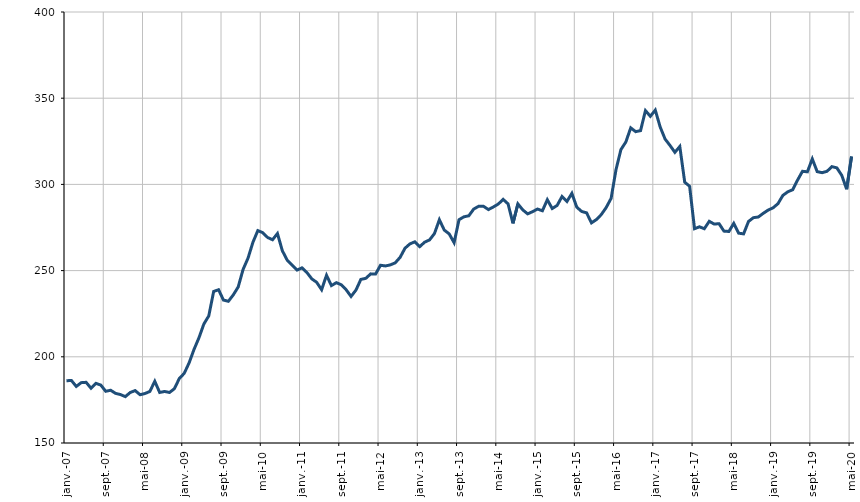
| Category | Catégorie D |
|---|---|
| 2007-01-01 | 186.1 |
| 2007-02-01 | 186.3 |
| 2007-03-01 | 182.8 |
| 2007-04-01 | 185 |
| 2007-05-01 | 185.2 |
| 2007-06-01 | 181.8 |
| 2007-07-01 | 184.6 |
| 2007-08-01 | 183.6 |
| 2007-09-01 | 180 |
| 2007-10-01 | 180.6 |
| 2007-11-01 | 178.8 |
| 2007-12-01 | 178.1 |
| 2008-01-01 | 176.9 |
| 2008-02-01 | 179.3 |
| 2008-03-01 | 180.4 |
| 2008-04-01 | 178 |
| 2008-05-01 | 178.7 |
| 2008-06-01 | 179.9 |
| 2008-07-01 | 185.8 |
| 2008-08-01 | 179.3 |
| 2008-09-01 | 179.9 |
| 2008-10-01 | 179.3 |
| 2008-11-01 | 181.5 |
| 2008-12-01 | 187.4 |
| 2009-01-01 | 190.4 |
| 2009-02-01 | 196.5 |
| 2009-03-01 | 204.3 |
| 2009-04-01 | 211 |
| 2009-05-01 | 219 |
| 2009-06-01 | 223.7 |
| 2009-07-01 | 237.9 |
| 2009-08-01 | 238.9 |
| 2009-09-01 | 232.9 |
| 2009-10-01 | 232.2 |
| 2009-11-01 | 235.9 |
| 2009-12-01 | 240.5 |
| 2010-01-01 | 250.7 |
| 2010-02-01 | 257.2 |
| 2010-03-01 | 266.4 |
| 2010-04-01 | 273.2 |
| 2010-05-01 | 272 |
| 2010-06-01 | 269.2 |
| 2010-07-01 | 267.9 |
| 2010-08-01 | 271.5 |
| 2010-09-01 | 261.5 |
| 2010-10-01 | 256 |
| 2010-11-01 | 253.1 |
| 2010-12-01 | 250.3 |
| 2011-01-01 | 251.6 |
| 2011-02-01 | 248.9 |
| 2011-03-01 | 245.2 |
| 2011-04-01 | 243.2 |
| 2011-05-01 | 238.9 |
| 2011-06-01 | 247.3 |
| 2011-07-01 | 241.3 |
| 2011-08-01 | 243 |
| 2011-09-01 | 241.8 |
| 2011-10-01 | 238.9 |
| 2011-11-01 | 235 |
| 2011-12-01 | 238.7 |
| 2012-01-01 | 244.9 |
| 2012-02-01 | 245.5 |
| 2012-03-01 | 248.1 |
| 2012-04-01 | 248 |
| 2012-05-01 | 253.1 |
| 2012-06-01 | 252.7 |
| 2012-07-01 | 253.3 |
| 2012-08-01 | 254.5 |
| 2012-09-01 | 257.7 |
| 2012-10-01 | 263 |
| 2012-11-01 | 265.5 |
| 2012-12-01 | 266.7 |
| 2013-01-01 | 263.9 |
| 2013-02-01 | 266.5 |
| 2013-03-01 | 267.8 |
| 2013-04-01 | 271.5 |
| 2013-05-01 | 279.5 |
| 2013-06-01 | 273.5 |
| 2013-07-01 | 271.3 |
| 2013-08-01 | 266.2 |
| 2013-09-01 | 279.5 |
| 2013-10-01 | 281.2 |
| 2013-11-01 | 281.8 |
| 2013-12-01 | 285.7 |
| 2014-01-01 | 287.3 |
| 2014-02-01 | 287.3 |
| 2014-03-01 | 285.4 |
| 2014-04-01 | 286.9 |
| 2014-05-01 | 288.6 |
| 2014-06-01 | 291.3 |
| 2014-07-01 | 288.7 |
| 2014-08-01 | 277.4 |
| 2014-09-01 | 288.7 |
| 2014-10-01 | 285.2 |
| 2014-11-01 | 282.9 |
| 2014-12-01 | 284.2 |
| 2015-01-01 | 285.7 |
| 2015-02-01 | 284.7 |
| 2015-03-01 | 291.1 |
| 2015-04-01 | 286 |
| 2015-05-01 | 287.8 |
| 2015-06-01 | 293 |
| 2015-07-01 | 290.1 |
| 2015-08-01 | 294.8 |
| 2015-09-01 | 286.8 |
| 2015-10-01 | 284.3 |
| 2015-11-01 | 283.5 |
| 2015-12-01 | 277.7 |
| 2016-01-01 | 279.6 |
| 2016-02-01 | 282.5 |
| 2016-03-01 | 286.6 |
| 2016-04-01 | 291.9 |
| 2016-05-01 | 308.6 |
| 2016-06-01 | 320.2 |
| 2016-07-01 | 324.6 |
| 2016-08-01 | 332.8 |
| 2016-09-01 | 330.6 |
| 2016-10-01 | 331.2 |
| 2016-11-01 | 342.8 |
| 2016-12-01 | 339.5 |
| 2017-01-01 | 343.1 |
| 2017-02-01 | 333.3 |
| 2017-03-01 | 326.3 |
| 2017-04-01 | 322.6 |
| 2017-05-01 | 318.6 |
| 2017-06-01 | 322 |
| 2017-07-01 | 301.3 |
| 2017-08-01 | 298.9 |
| 2017-09-01 | 274.3 |
| 2017-10-01 | 275.4 |
| 2017-11-01 | 274.3 |
| 2017-12-01 | 278.6 |
| 2018-01-01 | 277 |
| 2018-02-01 | 277.2 |
| 2018-03-01 | 272.9 |
| 2018-04-01 | 272.7 |
| 2018-05-01 | 277.4 |
| 2018-06-01 | 271.7 |
| 2018-07-01 | 271.3 |
| 2018-08-01 | 278.5 |
| 2018-09-01 | 280.7 |
| 2018-10-01 | 281.1 |
| 2018-11-01 | 283.2 |
| 2018-12-01 | 285.1 |
| 2019-01-01 | 286.4 |
| 2019-02-01 | 288.8 |
| 2019-03-01 | 293.6 |
| 2019-04-01 | 295.7 |
| 2019-05-01 | 296.9 |
| 2019-06-01 | 302.5 |
| 2019-07-01 | 307.6 |
| 2019-08-01 | 307.3 |
| 2019-09-01 | 314.8 |
| 2019-10-01 | 307.4 |
| 2019-11-01 | 306.8 |
| 2019-12-01 | 307.6 |
| 2020-01-01 | 310.3 |
| 2020-02-01 | 309.6 |
| 2020-03-01 | 305.3 |
| 2020-04-01 | 297.2 |
| 2020-05-01 | 316.2 |